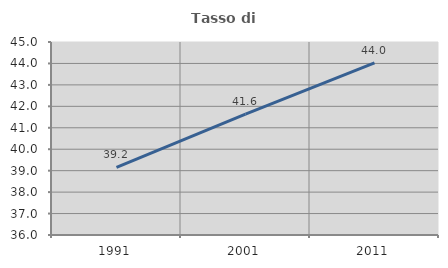
| Category | Tasso di occupazione   |
|---|---|
| 1991.0 | 39.159 |
| 2001.0 | 41.641 |
| 2011.0 | 44.025 |